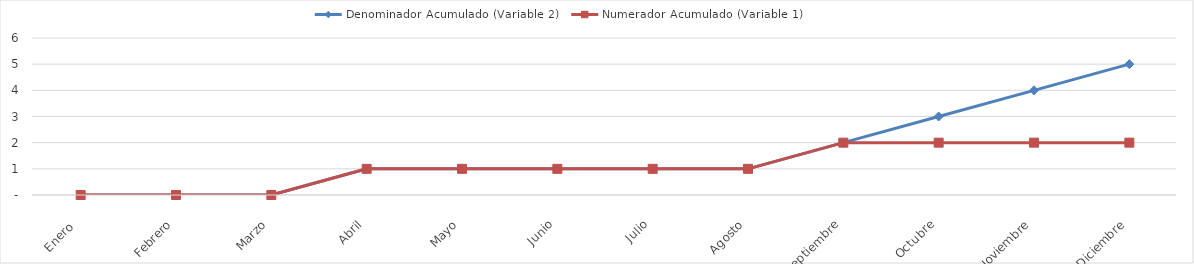
| Category | Denominador Acumulado (Variable 2) | Numerador Acumulado (Variable 1) |
|---|---|---|
| Enero  | 0 | 0 |
| Febrero | 0 | 0 |
| Marzo | 0 | 0 |
| Abril | 1 | 1 |
| Mayo | 1 | 1 |
| Junio | 1 | 1 |
| Julio | 1 | 1 |
| Agosto | 1 | 1 |
| Septiembre | 2 | 2 |
| Octubre | 3 | 2 |
| Noviembre | 4 | 2 |
| Diciembre | 5 | 2 |